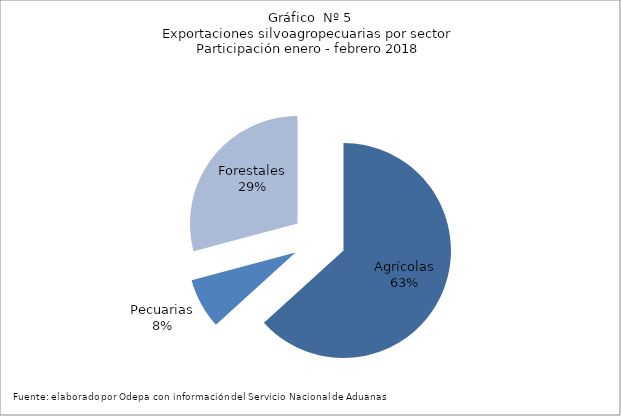
| Category | Series 0 |
|---|---|
| Agrícolas | 2105368 |
| Pecuarias | 252572 |
| Forestales | 970374 |